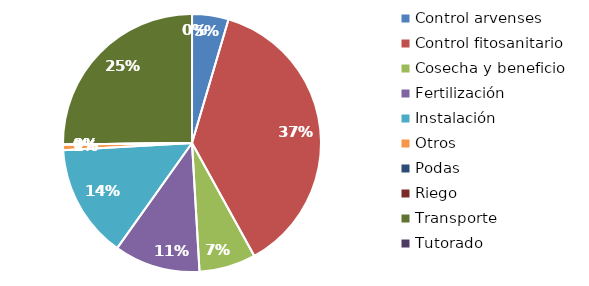
| Category | Valor |
|---|---|
| Control arvenses | 129000 |
| Control fitosanitario | 1055000 |
| Cosecha y beneficio | 200000 |
| Fertilización | 304000 |
| Instalación | 402500 |
| Otros | 20000 |
| Podas | 0 |
| Riego | 0 |
| Transporte | 710000 |
| Tutorado | 0 |